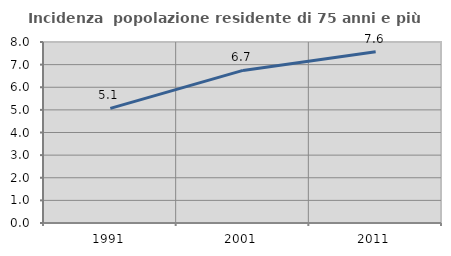
| Category | Incidenza  popolazione residente di 75 anni e più |
|---|---|
| 1991.0 | 5.068 |
| 2001.0 | 6.745 |
| 2011.0 | 7.573 |